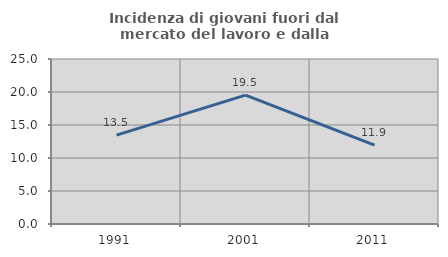
| Category | Incidenza di giovani fuori dal mercato del lavoro e dalla formazione  |
|---|---|
| 1991.0 | 13.456 |
| 2001.0 | 19.529 |
| 2011.0 | 11.945 |